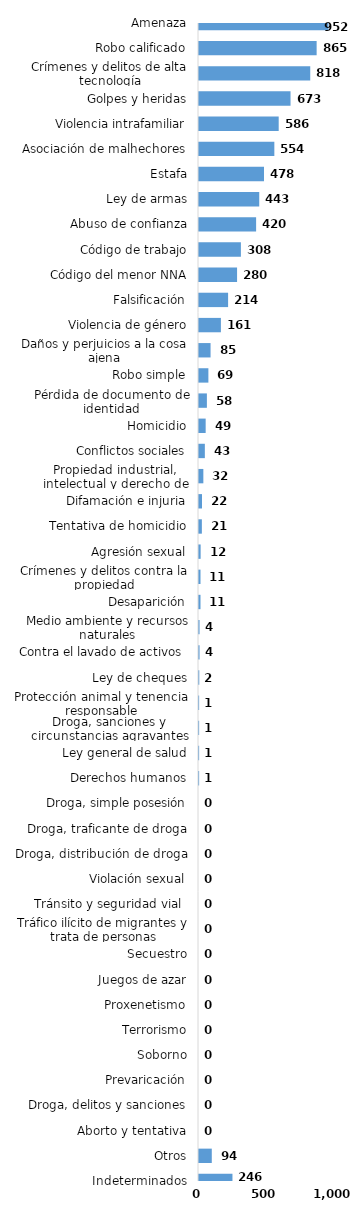
| Category | Series 0 |
|---|---|
| Amenaza | 952 |
| Robo calificado | 865 |
| Crímenes y delitos de alta tecnología | 818 |
| Golpes y heridas | 673 |
| Violencia intrafamiliar | 586 |
| Asociación de malhechores | 554 |
| Estafa | 478 |
| Ley de armas | 443 |
| Abuso de confianza | 420 |
| Código de trabajo | 308 |
| Código del menor NNA | 280 |
| Falsificación | 214 |
| Violencia de género | 161 |
| Daños y perjuicios a la cosa ajena | 85 |
| Robo simple | 69 |
| Pérdida de documento de identidad | 58 |
| Homicidio | 49 |
| Conflictos sociales | 43 |
| Propiedad industrial, intelectual y derecho de autor | 32 |
| Difamación e injuria | 22 |
| Tentativa de homicidio | 21 |
| Agresión sexual | 12 |
| Crímenes y delitos contra la propiedad | 11 |
| Desaparición | 11 |
| Medio ambiente y recursos naturales | 4 |
| Contra el lavado de activos  | 4 |
| Ley de cheques | 2 |
| Protección animal y tenencia responsable | 1 |
| Droga, sanciones y circunstancias agravantes | 1 |
| Ley general de salud | 1 |
| Derechos humanos | 1 |
| Droga, simple posesión | 0 |
| Droga, traficante de droga | 0 |
| Droga, distribución de droga | 0 |
| Violación sexual | 0 |
| Tránsito y seguridad vial  | 0 |
| Tráfico ilícito de migrantes y trata de personas | 0 |
| Secuestro | 0 |
| Juegos de azar | 0 |
| Proxenetismo | 0 |
| Terrorismo | 0 |
| Soborno | 0 |
| Prevaricación | 0 |
| Droga, delitos y sanciones | 0 |
| Aborto y tentativa | 0 |
| Otros | 94 |
| Indeterminados | 246 |